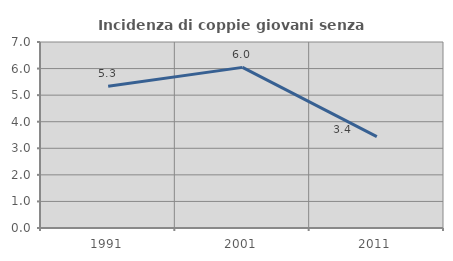
| Category | Incidenza di coppie giovani senza figli |
|---|---|
| 1991.0 | 5.337 |
| 2001.0 | 6.045 |
| 2011.0 | 3.44 |